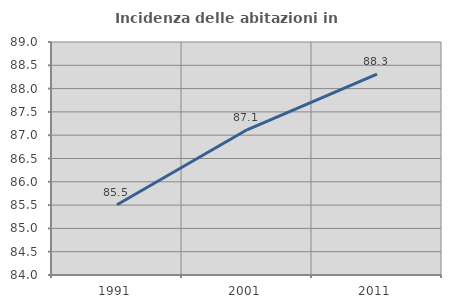
| Category | Incidenza delle abitazioni in proprietà  |
|---|---|
| 1991.0 | 85.507 |
| 2001.0 | 87.117 |
| 2011.0 | 88.312 |